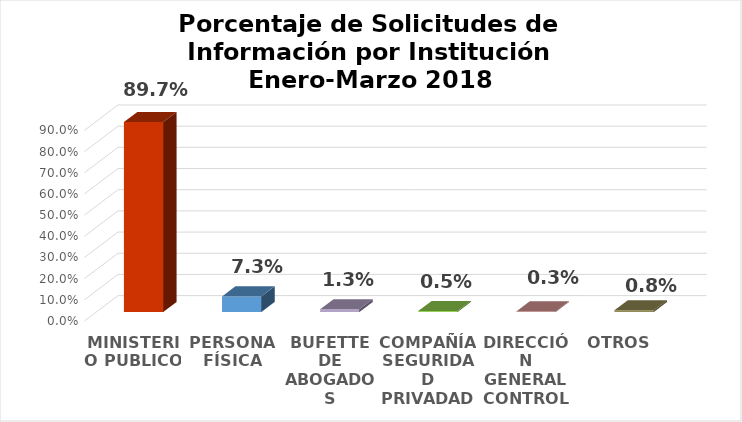
| Category | Series 0 |
|---|---|
| MINISTERIO PUBLICO | 0.897 |
| PERSONA FÍSICA | 0.073 |
| BUFETTE DE ABOGADOS | 0.013 |
| COMPAÑÍA SEGURIDAD PRIVADAD | 0.005 |
| DIRECCIÓN GENERAL CONTROL DE DROGAS | 0.003 |
| OTROS  | 0.008 |